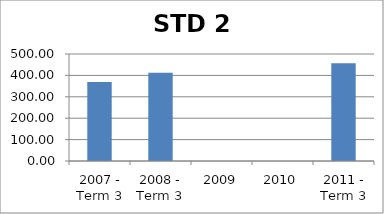
| Category | Score |
|---|---|
| 2007 - Term 3 | 369.32 |
| 2008 - Term 3 | 412.6 |
| 2009 | 0 |
| 2010 | 0 |
| 2011 - Term 3 | 456.91 |